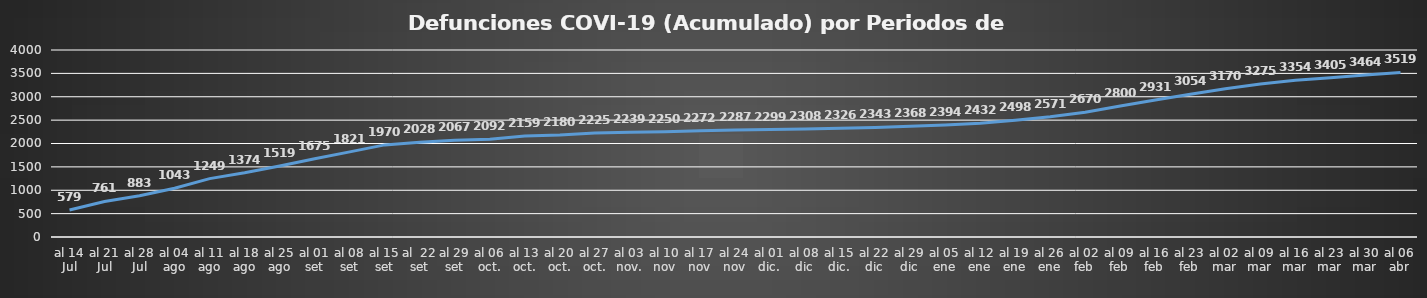
| Category | Series 0 |
|---|---|
| al 14 Jul | 579 |
| al 21 Jul | 761 |
| al 28 Jul | 883 |
| al 04 ago | 1043 |
| al 11 ago | 1249 |
| al 18 ago | 1374 |
| al 25 ago | 1519 |
| al 01 set | 1675 |
| al 08 set | 1821 |
| al 15 set | 1970 |
| al  22 set | 2028 |
| al 29 set | 2067 |
| al 06 oct. | 2092 |
| al 13 oct. | 2159 |
| al 20 oct. | 2180 |
| al 27 oct. | 2225 |
| al 03 nov. | 2239 |
| al 10 nov | 2250 |
| al 17 nov | 2272 |
| al 24 nov | 2287 |
| al 01 dic. | 2299 |
| al 08 dic | 2308 |
| al 15 dic. | 2326 |
| al 22 dic | 2343 |
| al 29 dic | 2368 |
| al 05 ene | 2394 |
| al 12 ene | 2432 |
| al 19 ene | 2498 |
| al 26 ene | 2571 |
| al 02 feb | 2670 |
| al 09 feb | 2800 |
| al 16 feb | 2931 |
| al 23 feb | 3054 |
| al 02 mar | 3170 |
| al 09 mar | 3275 |
| al 16 mar | 3354 |
| al 23 mar | 3405 |
| al 30 mar | 3464 |
| al 06 abr | 3519 |